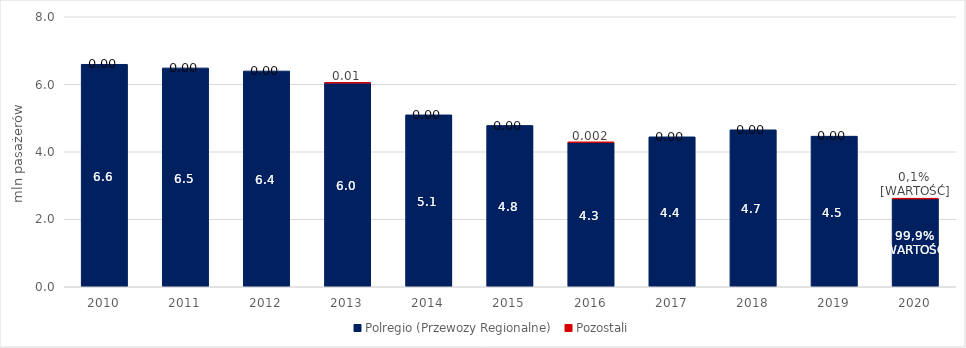
| Category | Polregio (Przewozy Regionalne) | Pozostali |
|---|---|---|
| 2010 | 6.594 | 0 |
| 2011 | 6.485 | 0 |
| 2012 | 6.395 | 0 |
| 2013 | 6.039 | 0.015 |
| 2014 | 5.095 | 0 |
| 2015 | 4.781 | 0 |
| 2016 | 4.28 | 0.002 |
| 2017 | 4.444 | 0 |
| 2018 | 4.652 | 0 |
| 2019 | 4.464 | 0 |
| 2020 | 2.611 | 0.003 |